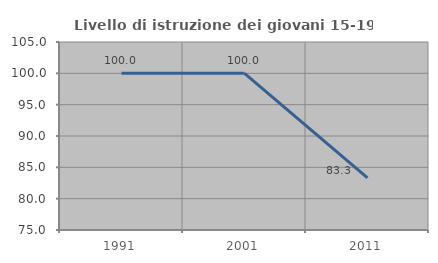
| Category | Livello di istruzione dei giovani 15-19 anni |
|---|---|
| 1991.0 | 100 |
| 2001.0 | 100 |
| 2011.0 | 83.333 |